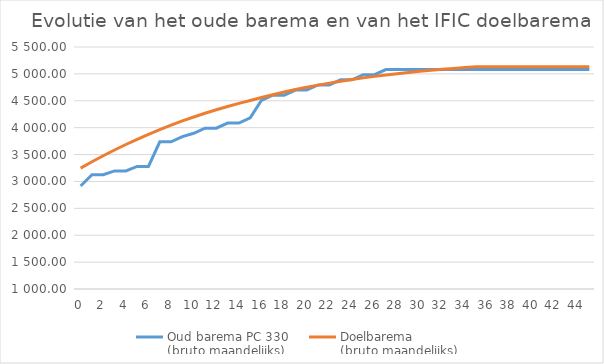
| Category | Oud barema PC 330 
(bruto maandelijks) | Doelbarema | Doelbarema 
(bruto maandelijks) |
|---|---|---|---|
| 0.0 | 2914.26 |  | 3248.69 |
| 1.0 | 3124.12 |  | 3365.65 |
| 2.0 | 3124.12 |  | 3477.73 |
| 3.0 | 3195.8 |  | 3584.85 |
| 4.0 | 3195.8 |  | 3686.99 |
| 5.0 | 3279.42 |  | 3784.16 |
| 6.0 | 3279.42 |  | 3876.41 |
| 7.0 | 3737.37 |  | 3963.82 |
| 8.0 | 3737.37 |  | 4046.51 |
| 9.0 | 3832.47 |  | 4124.58 |
| 10.0 | 3895.87 |  | 4198.2 |
| 11.0 | 3990.97 |  | 4267.51 |
| 12.0 | 3990.97 |  | 4332.68 |
| 13.0 | 4086.07 |  | 4393.88 |
| 14.0 | 4086.07 |  | 4451.28 |
| 15.0 | 4181.17 |  | 4505.09 |
| 16.0 | 4508.75 |  | 4561.05 |
| 17.0 | 4603.85 |  | 4613.45 |
| 18.0 | 4603.85 |  | 4662.49 |
| 19.0 | 4698.95 |  | 4708.32 |
| 20.0 | 4698.95 |  | 4751.14 |
| 21.0 | 4794.06 |  | 4791.11 |
| 22.0 | 4794.06 |  | 4828.4 |
| 23.0 | 4889.16 |  | 4863.14 |
| 24.0 | 4889.16 |  | 4895.51 |
| 25.0 | 4984.26 |  | 4925.67 |
| 26.0 | 4984.26 |  | 4953.73 |
| 27.0 | 5079.36 |  | 4979.83 |
| 28.0 | 5079.36 |  | 5004.1 |
| 29.0 | 5079.36 |  | 5026.66 |
| 30.0 | 5079.36 |  | 5047.62 |
| 31.0 | 5079.36 |  | 5067.09 |
| 32.0 | 5079.36 |  | 5085.17 |
| 33.0 | 5079.36 |  | 5101.96 |
| 34.0 | 5079.36 |  | 5117.54 |
| 35.0 | 5079.36 |  | 5131.98 |
| 36.0 | 5079.36 |  | 5131.98 |
| 37.0 | 5079.36 |  | 5131.98 |
| 38.0 | 5079.36 |  | 5131.98 |
| 39.0 | 5079.36 |  | 5131.98 |
| 40.0 | 5079.36 |  | 5131.98 |
| 41.0 | 5079.36 |  | 5131.98 |
| 42.0 | 5079.36 |  | 5131.98 |
| 43.0 | 5079.36 |  | 5131.98 |
| 44.0 | 5079.36 |  | 5131.98 |
| 45.0 | 5079.36 |  | 5131.98 |